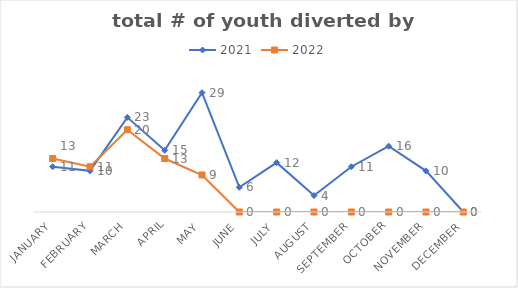
| Category | 2021 | 2022 |
|---|---|---|
| January | 11 | 13 |
| February | 10 | 11 |
| March | 23 | 20 |
| April | 15 | 13 |
| May | 29 | 9 |
| June | 6 | 0 |
| July | 12 | 0 |
| August | 4 | 0 |
| September | 11 | 0 |
| October | 16 | 0 |
| November | 10 | 0 |
| December | 0 | 0 |